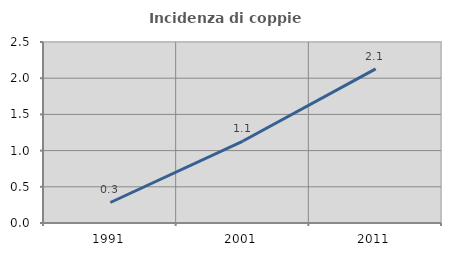
| Category | Incidenza di coppie miste |
|---|---|
| 1991.0 | 0.283 |
| 2001.0 | 1.132 |
| 2011.0 | 2.129 |